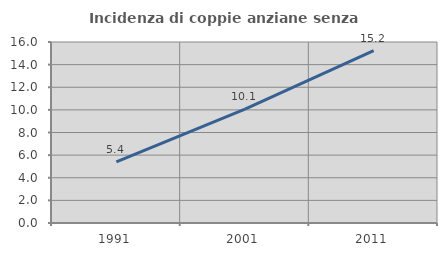
| Category | Incidenza di coppie anziane senza figli  |
|---|---|
| 1991.0 | 5.411 |
| 2001.0 | 10.074 |
| 2011.0 | 15.231 |